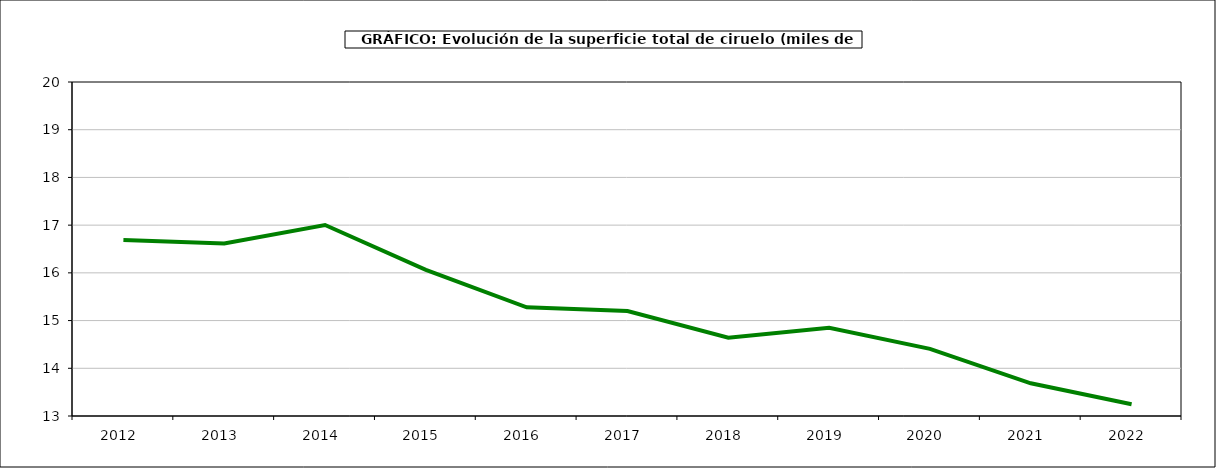
| Category | superficie ciruelo |
|---|---|
| 2012.0 | 16.687 |
| 2013.0 | 16.614 |
| 2014.0 | 17.003 |
| 2015.0 | 16.064 |
| 2016.0 | 15.278 |
| 2017.0 | 15.199 |
| 2018.0 | 14.64 |
| 2019.0 | 14.851 |
| 2020.0 | 14.406 |
| 2021.0 | 13.685 |
| 2022.0 | 13.245 |